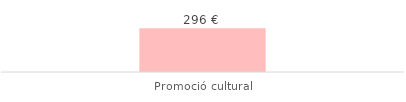
| Category | Total |
|---|---|
| Promoció cultural | 296.3 |